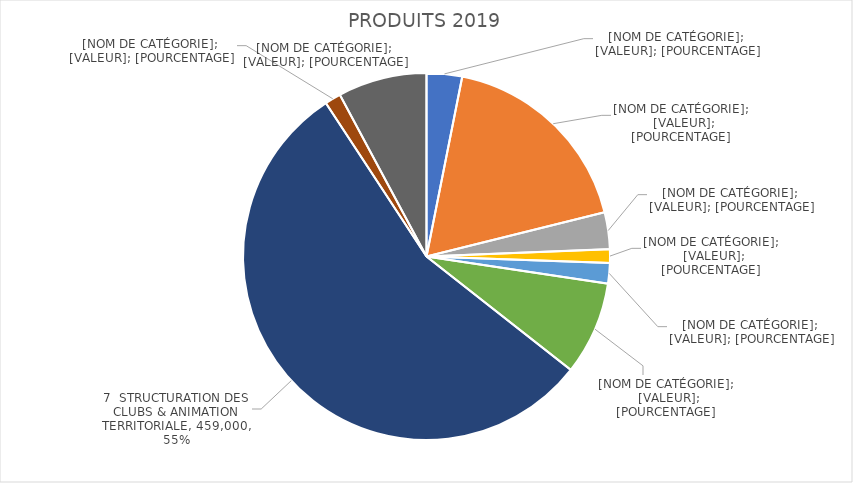
| Category | Series 0 |
|---|---|
| 1 ATHLETISME COMPETITION | 26000 |
| 2 SUIVI ATHLETES | 149780 |
| 3 ATHLETISME DES JEUNES | 26950 |
| 4 ATHLE HORS STADE | 10000 |
| 5 ATHLE SANTE LOISIRS | 15000 |
| 6 FORMATIONS | 68500 |
| 7  STRUCTURATION DES CLUBS & ANIMATION TERRITORIALE | 459000 |
| 8 STRUCTURE REGIONALE | 11750 |
| 9 ADMINISTRATION | 65144.86 |